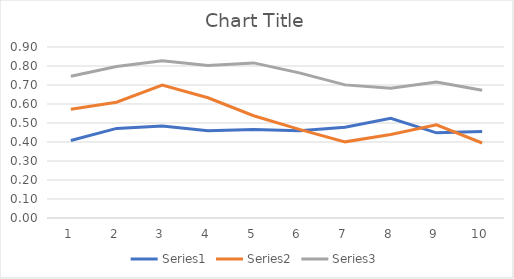
| Category | Series 0 | Series 1 | Series 2 |
|---|---|---|---|
| 0 | 0.408 | 0.572 | 0.746 |
| 1 | 0.472 | 0.609 | 0.798 |
| 2 | 0.485 | 0.699 | 0.828 |
| 3 | 0.459 | 0.633 | 0.802 |
| 4 | 0.466 | 0.538 | 0.816 |
| 5 | 0.459 | 0.467 | 0.764 |
| 6 | 0.478 | 0.401 | 0.701 |
| 7 | 0.525 | 0.44 | 0.683 |
| 8 | 0.448 | 0.49 | 0.716 |
| 9 | 0.455 | 0.395 | 0.673 |